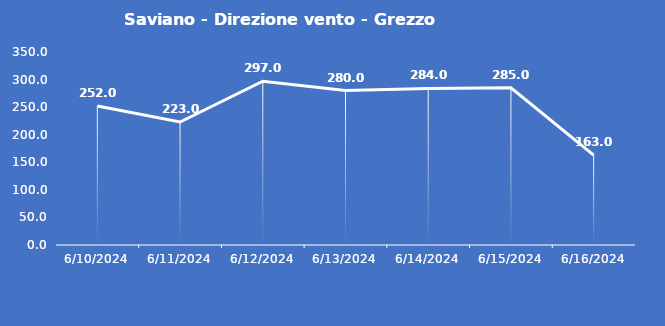
| Category | Saviano - Direzione vento - Grezzo (°N) |
|---|---|
| 6/10/24 | 252 |
| 6/11/24 | 223 |
| 6/12/24 | 297 |
| 6/13/24 | 280 |
| 6/14/24 | 284 |
| 6/15/24 | 285 |
| 6/16/24 | 163 |